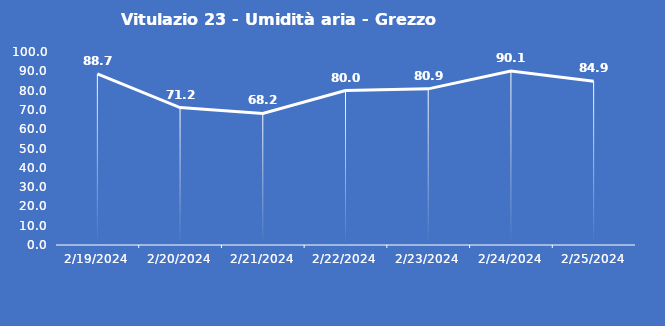
| Category | Vitulazio 23 - Umidità aria - Grezzo (%) |
|---|---|
| 2/19/24 | 88.7 |
| 2/20/24 | 71.2 |
| 2/21/24 | 68.2 |
| 2/22/24 | 80 |
| 2/23/24 | 80.9 |
| 2/24/24 | 90.1 |
| 2/25/24 | 84.9 |